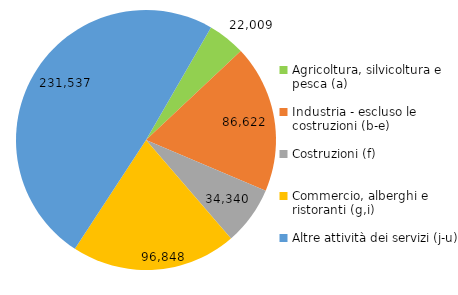
| Category | Series 0 |
|---|---|
| Agricoltura, silvicoltura e pesca (a) | 22009 |
| Industria - escluso le costruzioni (b-e) | 86622 |
| Costruzioni (f) | 34340 |
| Commercio, alberghi e ristoranti (g,i) | 96848 |
| Altre attività dei servizi (j-u) | 231537 |